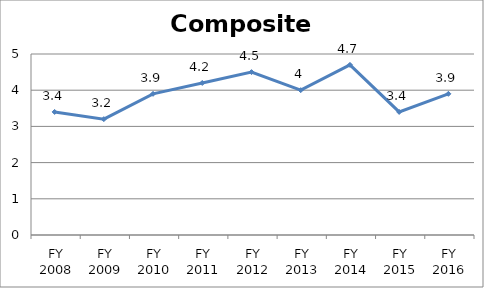
| Category | Composite score |
|---|---|
| FY 2016 | 3.9 |
| FY 2015 | 3.4 |
| FY 2014 | 4.7 |
| FY 2013 | 4 |
| FY 2012 | 4.5 |
| FY 2011 | 4.2 |
| FY 2010 | 3.9 |
| FY 2009 | 3.2 |
| FY 2008 | 3.4 |